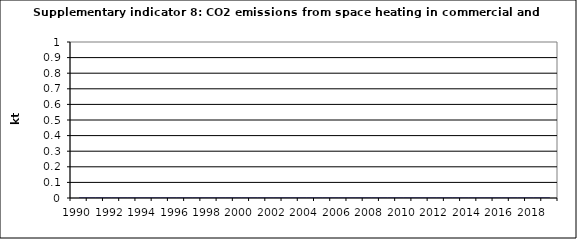
| Category | CO2 emissions from space heating in commercial and institutional, kt |
|---|---|
| 1990 | 0 |
| 1991 | 0 |
| 1992 | 0 |
| 1993 | 0 |
| 1994 | 0 |
| 1995 | 0 |
| 1996 | 0 |
| 1997 | 0 |
| 1998 | 0 |
| 1999 | 0 |
| 2000 | 0 |
| 2001 | 0 |
| 2002 | 0 |
| 2003 | 0 |
| 2004 | 0 |
| 2005 | 0 |
| 2006 | 0 |
| 2007 | 0 |
| 2008 | 0 |
| 2009 | 0 |
| 2010 | 0 |
| 2011 | 0 |
| 2012 | 0 |
| 2013 | 0 |
| 2014 | 0 |
| 2015 | 0 |
| 2016 | 0 |
| 2017 | 0 |
| 2018 | 0 |
| 2019 | 0 |